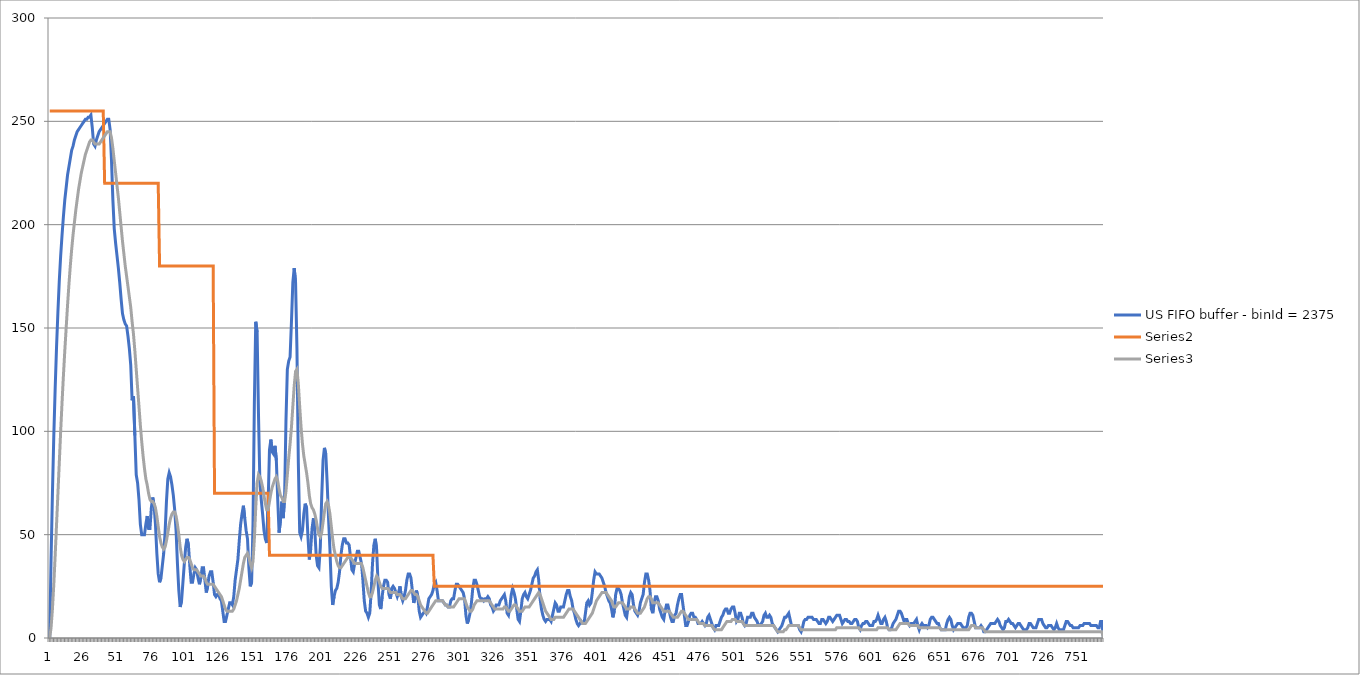
| Category | US FIFO buffer - binId = 2375 | Series 1 | Series 2 |
|---|---|---|---|
| 0 | 0 | 255 | 0 |
| 1 | 38 | 255 | 5 |
| 2 | 70 | 255 | 14 |
| 3 | 98 | 255 | 26 |
| 4 | 121 | 255 | 40 |
| 5 | 141 | 255 | 55 |
| 6 | 158 | 255 | 70 |
| 7 | 173 | 255 | 85 |
| 8 | 185 | 255 | 100 |
| 9 | 195 | 255 | 114 |
| 10 | 204 | 255 | 127 |
| 11 | 212 | 255 | 139 |
| 12 | 218 | 255 | 150 |
| 13 | 224 | 255 | 161 |
| 14 | 228 | 255 | 171 |
| 15 | 232 | 255 | 180 |
| 16 | 236 | 255 | 188 |
| 17 | 238 | 255 | 195 |
| 18 | 241 | 255 | 201 |
| 19 | 243 | 255 | 207 |
| 20 | 245 | 255 | 212 |
| 21 | 246 | 255 | 217 |
| 22 | 247 | 255 | 221 |
| 23 | 248 | 255 | 225 |
| 24 | 249 | 255 | 228 |
| 25 | 250 | 255 | 231 |
| 26 | 251 | 255 | 234 |
| 27 | 251 | 255 | 236 |
| 28 | 252 | 255 | 238 |
| 29 | 252 | 255 | 240 |
| 30 | 253 | 255 | 241 |
| 31 | 247 | 255 | 241 |
| 32 | 239 | 255 | 240 |
| 33 | 238 | 255 | 239 |
| 34 | 241 | 255 | 239 |
| 35 | 243 | 255 | 239 |
| 36 | 245 | 255 | 239 |
| 37 | 246 | 255 | 240 |
| 38 | 247 | 255 | 241 |
| 39 | 248 | 255 | 242 |
| 40 | 249 | 220 | 243 |
| 41 | 250 | 220 | 244 |
| 42 | 251 | 220 | 245 |
| 43 | 251 | 220 | 245 |
| 44 | 246 | 220 | 245 |
| 45 | 231 | 220 | 242 |
| 46 | 212 | 220 | 237 |
| 47 | 198 | 220 | 231 |
| 48 | 191 | 220 | 225 |
| 49 | 185 | 220 | 219 |
| 50 | 179 | 220 | 213 |
| 51 | 172 | 220 | 206 |
| 52 | 164 | 220 | 199 |
| 53 | 157 | 220 | 192 |
| 54 | 154 | 220 | 186 |
| 55 | 152 | 220 | 180 |
| 56 | 151 | 220 | 175 |
| 57 | 146 | 220 | 170 |
| 58 | 140 | 220 | 165 |
| 59 | 132 | 220 | 160 |
| 60 | 115 | 220 | 153 |
| 61 | 117 | 220 | 147 |
| 62 | 98 | 220 | 139 |
| 63 | 79 | 220 | 130 |
| 64 | 75 | 220 | 121 |
| 65 | 67 | 220 | 112 |
| 66 | 55 | 220 | 103 |
| 67 | 50 | 220 | 95 |
| 68 | 50 | 220 | 88 |
| 69 | 50 | 220 | 82 |
| 70 | 55 | 220 | 77 |
| 71 | 59 | 220 | 74 |
| 72 | 53 | 220 | 70 |
| 73 | 53 | 220 | 67 |
| 74 | 63 | 220 | 66 |
| 75 | 68 | 220 | 66 |
| 76 | 64 | 220 | 65 |
| 77 | 55 | 220 | 63 |
| 78 | 41 | 220 | 59 |
| 79 | 31 | 220 | 54 |
| 80 | 27 | 180 | 49 |
| 81 | 29 | 180 | 46 |
| 82 | 35 | 180 | 44 |
| 83 | 41 | 180 | 43 |
| 84 | 51 | 180 | 44 |
| 85 | 66 | 180 | 47 |
| 86 | 77 | 180 | 51 |
| 87 | 80 | 180 | 55 |
| 88 | 78 | 180 | 58 |
| 89 | 74 | 180 | 60 |
| 90 | 69 | 180 | 61 |
| 91 | 62 | 180 | 61 |
| 92 | 52 | 180 | 59 |
| 93 | 36 | 180 | 55 |
| 94 | 23 | 180 | 50 |
| 95 | 15 | 180 | 44 |
| 96 | 18 | 180 | 40 |
| 97 | 27 | 180 | 38 |
| 98 | 36 | 180 | 37 |
| 99 | 44 | 180 | 38 |
| 100 | 48 | 180 | 39 |
| 101 | 45 | 180 | 39 |
| 102 | 35 | 180 | 38 |
| 103 | 27 | 180 | 36 |
| 104 | 27 | 180 | 34 |
| 105 | 31 | 180 | 33 |
| 106 | 34 | 180 | 33 |
| 107 | 33 | 180 | 33 |
| 108 | 29 | 180 | 32 |
| 109 | 26 | 180 | 31 |
| 110 | 29 | 180 | 30 |
| 111 | 34 | 180 | 30 |
| 112 | 34 | 180 | 30 |
| 113 | 28 | 180 | 29 |
| 114 | 22 | 180 | 27 |
| 115 | 25 | 180 | 26 |
| 116 | 30 | 180 | 26 |
| 117 | 32 | 180 | 26 |
| 118 | 32 | 180 | 26 |
| 119 | 27 | 180 | 26 |
| 120 | 21 | 70 | 25 |
| 121 | 20 | 70 | 24 |
| 122 | 21 | 70 | 23 |
| 123 | 21 | 70 | 22 |
| 124 | 19 | 70 | 21 |
| 125 | 18 | 70 | 20 |
| 126 | 13 | 70 | 18 |
| 127 | 8 | 70 | 16 |
| 128 | 8 | 70 | 14 |
| 129 | 11 | 70 | 13 |
| 130 | 14 | 70 | 13 |
| 131 | 17 | 70 | 13 |
| 132 | 17 | 70 | 13 |
| 133 | 16 | 70 | 13 |
| 134 | 20 | 70 | 14 |
| 135 | 28 | 70 | 16 |
| 136 | 33 | 70 | 18 |
| 137 | 38 | 70 | 21 |
| 138 | 47 | 70 | 24 |
| 139 | 55 | 70 | 28 |
| 140 | 60 | 70 | 32 |
| 141 | 64 | 70 | 36 |
| 142 | 58 | 70 | 39 |
| 143 | 52 | 70 | 40 |
| 144 | 48 | 70 | 41 |
| 145 | 34 | 70 | 39 |
| 146 | 25 | 70 | 36 |
| 147 | 27 | 70 | 34 |
| 148 | 55 | 70 | 37 |
| 149 | 114 | 70 | 48 |
| 150 | 153 | 70 | 63 |
| 151 | 148 | 70 | 75 |
| 152 | 108 | 70 | 79 |
| 153 | 76 | 70 | 78 |
| 154 | 67 | 70 | 76 |
| 155 | 60 | 70 | 73 |
| 156 | 52 | 70 | 69 |
| 157 | 48 | 70 | 65 |
| 158 | 46 | 70 | 62 |
| 159 | 65 | 70 | 62 |
| 160 | 91 | 40 | 66 |
| 161 | 96 | 40 | 70 |
| 162 | 90 | 40 | 73 |
| 163 | 89 | 40 | 75 |
| 164 | 93 | 40 | 77 |
| 165 | 86 | 40 | 78 |
| 166 | 67 | 40 | 76 |
| 167 | 51 | 40 | 72 |
| 168 | 57 | 40 | 69 |
| 169 | 66 | 40 | 68 |
| 170 | 58 | 40 | 66 |
| 171 | 68 | 40 | 66 |
| 172 | 105 | 40 | 71 |
| 173 | 130 | 40 | 79 |
| 174 | 134 | 40 | 87 |
| 175 | 136 | 40 | 94 |
| 176 | 153 | 40 | 102 |
| 177 | 172 | 40 | 112 |
| 178 | 179 | 40 | 122 |
| 179 | 172 | 40 | 129 |
| 180 | 140 | 40 | 130 |
| 181 | 85 | 40 | 123 |
| 182 | 51 | 40 | 112 |
| 183 | 49 | 40 | 102 |
| 184 | 52 | 40 | 94 |
| 185 | 60 | 40 | 88 |
| 186 | 65 | 40 | 84 |
| 187 | 63 | 40 | 80 |
| 188 | 49 | 40 | 75 |
| 189 | 38 | 40 | 69 |
| 190 | 43 | 40 | 65 |
| 191 | 53 | 40 | 63 |
| 192 | 58 | 40 | 62 |
| 193 | 52 | 40 | 60 |
| 194 | 40 | 40 | 57 |
| 195 | 35 | 40 | 53 |
| 196 | 34 | 40 | 50 |
| 197 | 44 | 40 | 49 |
| 198 | 68 | 40 | 51 |
| 199 | 86 | 40 | 56 |
| 200 | 92 | 40 | 61 |
| 201 | 89 | 40 | 65 |
| 202 | 75 | 40 | 66 |
| 203 | 58 | 40 | 64 |
| 204 | 43 | 40 | 60 |
| 205 | 25 | 40 | 54 |
| 206 | 16 | 40 | 48 |
| 207 | 20 | 40 | 43 |
| 208 | 23 | 40 | 40 |
| 209 | 24 | 40 | 37 |
| 210 | 27 | 40 | 35 |
| 211 | 32 | 40 | 34 |
| 212 | 40 | 40 | 34 |
| 213 | 45 | 40 | 35 |
| 214 | 48 | 40 | 36 |
| 215 | 48 | 40 | 37 |
| 216 | 46 | 40 | 38 |
| 217 | 46 | 40 | 39 |
| 218 | 45 | 40 | 39 |
| 219 | 39 | 40 | 39 |
| 220 | 33 | 40 | 38 |
| 221 | 32 | 40 | 37 |
| 222 | 36 | 40 | 36 |
| 223 | 39 | 40 | 36 |
| 224 | 42 | 40 | 36 |
| 225 | 42 | 40 | 36 |
| 226 | 39 | 40 | 36 |
| 227 | 36 | 40 | 36 |
| 228 | 28 | 40 | 34 |
| 229 | 18 | 40 | 31 |
| 230 | 13 | 40 | 28 |
| 231 | 12 | 40 | 25 |
| 232 | 10 | 40 | 22 |
| 233 | 12 | 40 | 20 |
| 234 | 22 | 40 | 20 |
| 235 | 36 | 40 | 22 |
| 236 | 45 | 40 | 25 |
| 237 | 48 | 40 | 28 |
| 238 | 43 | 40 | 30 |
| 239 | 27 | 40 | 29 |
| 240 | 16 | 40 | 27 |
| 241 | 14 | 40 | 25 |
| 242 | 20 | 40 | 24 |
| 243 | 25 | 40 | 24 |
| 244 | 28 | 40 | 24 |
| 245 | 28 | 40 | 24 |
| 246 | 27 | 40 | 24 |
| 247 | 21 | 40 | 23 |
| 248 | 19 | 40 | 22 |
| 249 | 24 | 40 | 22 |
| 250 | 25 | 40 | 22 |
| 251 | 24 | 40 | 22 |
| 252 | 22 | 40 | 22 |
| 253 | 20 | 40 | 21 |
| 254 | 22 | 40 | 21 |
| 255 | 25 | 40 | 21 |
| 256 | 20 | 40 | 20 |
| 257 | 18 | 40 | 19 |
| 258 | 20 | 40 | 19 |
| 259 | 23 | 40 | 19 |
| 260 | 28 | 40 | 20 |
| 261 | 31 | 40 | 21 |
| 262 | 31 | 40 | 22 |
| 263 | 29 | 40 | 23 |
| 264 | 23 | 40 | 23 |
| 265 | 17 | 40 | 22 |
| 266 | 19 | 40 | 21 |
| 267 | 23 | 40 | 21 |
| 268 | 20 | 40 | 20 |
| 269 | 13 | 40 | 18 |
| 270 | 10 | 40 | 16 |
| 271 | 11 | 40 | 15 |
| 272 | 12 | 40 | 14 |
| 273 | 13 | 40 | 13 |
| 274 | 12 | 40 | 12 |
| 275 | 15 | 40 | 12 |
| 276 | 19 | 40 | 13 |
| 277 | 20 | 40 | 14 |
| 278 | 21 | 40 | 15 |
| 279 | 23 | 40 | 16 |
| 280 | 26 | 25 | 17 |
| 281 | 27 | 25 | 18 |
| 282 | 23 | 25 | 18 |
| 283 | 18 | 25 | 18 |
| 284 | 18 | 25 | 18 |
| 285 | 18 | 25 | 18 |
| 286 | 18 | 25 | 18 |
| 287 | 17 | 25 | 17 |
| 288 | 16 | 25 | 16 |
| 289 | 16 | 25 | 16 |
| 290 | 15 | 25 | 15 |
| 291 | 15 | 25 | 15 |
| 292 | 18 | 25 | 15 |
| 293 | 19 | 25 | 15 |
| 294 | 19 | 25 | 15 |
| 295 | 23 | 25 | 16 |
| 296 | 26 | 25 | 17 |
| 297 | 26 | 25 | 18 |
| 298 | 25 | 25 | 19 |
| 299 | 24 | 25 | 19 |
| 300 | 23 | 25 | 19 |
| 301 | 22 | 25 | 19 |
| 302 | 19 | 25 | 19 |
| 303 | 11 | 25 | 17 |
| 304 | 7 | 25 | 15 |
| 305 | 9 | 25 | 14 |
| 306 | 12 | 25 | 13 |
| 307 | 17 | 25 | 13 |
| 308 | 24 | 25 | 14 |
| 309 | 28 | 25 | 16 |
| 310 | 28 | 25 | 17 |
| 311 | 26 | 25 | 18 |
| 312 | 23 | 25 | 18 |
| 313 | 20 | 25 | 18 |
| 314 | 19 | 25 | 18 |
| 315 | 19 | 25 | 18 |
| 316 | 18 | 25 | 18 |
| 317 | 19 | 25 | 18 |
| 318 | 19 | 25 | 18 |
| 319 | 20 | 25 | 18 |
| 320 | 19 | 25 | 18 |
| 321 | 16 | 25 | 17 |
| 322 | 15 | 25 | 16 |
| 323 | 13 | 25 | 15 |
| 324 | 14 | 25 | 14 |
| 325 | 16 | 25 | 14 |
| 326 | 16 | 25 | 14 |
| 327 | 16 | 25 | 14 |
| 328 | 18 | 25 | 14 |
| 329 | 19 | 25 | 14 |
| 330 | 20 | 25 | 14 |
| 331 | 21 | 25 | 15 |
| 332 | 18 | 25 | 15 |
| 333 | 12 | 25 | 14 |
| 334 | 11 | 25 | 13 |
| 335 | 15 | 25 | 13 |
| 336 | 21 | 25 | 14 |
| 337 | 24 | 25 | 15 |
| 338 | 22 | 25 | 16 |
| 339 | 19 | 25 | 16 |
| 340 | 14 | 25 | 15 |
| 341 | 9 | 25 | 14 |
| 342 | 8 | 25 | 13 |
| 343 | 13 | 25 | 13 |
| 344 | 19 | 25 | 13 |
| 345 | 21 | 25 | 14 |
| 346 | 22 | 25 | 15 |
| 347 | 20 | 25 | 15 |
| 348 | 19 | 25 | 15 |
| 349 | 21 | 25 | 15 |
| 350 | 23 | 25 | 16 |
| 351 | 26 | 25 | 17 |
| 352 | 29 | 25 | 18 |
| 353 | 30 | 25 | 19 |
| 354 | 32 | 25 | 20 |
| 355 | 33 | 25 | 21 |
| 356 | 28 | 25 | 22 |
| 357 | 19 | 25 | 21 |
| 358 | 14 | 25 | 19 |
| 359 | 11 | 25 | 17 |
| 360 | 9 | 25 | 15 |
| 361 | 8 | 25 | 13 |
| 362 | 9 | 25 | 12 |
| 363 | 9 | 25 | 11 |
| 364 | 9 | 25 | 10 |
| 365 | 8 | 25 | 9 |
| 366 | 11 | 25 | 9 |
| 367 | 14 | 25 | 9 |
| 368 | 17 | 25 | 10 |
| 369 | 16 | 25 | 10 |
| 370 | 13 | 25 | 10 |
| 371 | 13 | 25 | 10 |
| 372 | 15 | 25 | 10 |
| 373 | 15 | 25 | 10 |
| 374 | 15 | 25 | 10 |
| 375 | 18 | 25 | 11 |
| 376 | 21 | 25 | 12 |
| 377 | 23 | 25 | 13 |
| 378 | 23 | 25 | 14 |
| 379 | 20 | 25 | 14 |
| 380 | 18 | 25 | 14 |
| 381 | 14 | 25 | 14 |
| 382 | 12 | 25 | 13 |
| 383 | 9 | 25 | 12 |
| 384 | 7 | 25 | 11 |
| 385 | 6 | 25 | 10 |
| 386 | 7 | 25 | 9 |
| 387 | 8 | 25 | 8 |
| 388 | 7 | 25 | 7 |
| 389 | 7 | 25 | 7 |
| 390 | 12 | 25 | 7 |
| 391 | 17 | 25 | 8 |
| 392 | 18 | 25 | 9 |
| 393 | 16 | 25 | 10 |
| 394 | 17 | 25 | 11 |
| 395 | 22 | 25 | 12 |
| 396 | 28 | 25 | 14 |
| 397 | 32 | 25 | 16 |
| 398 | 31 | 25 | 18 |
| 399 | 31 | 25 | 19 |
| 400 | 31 | 25 | 20 |
| 401 | 30 | 25 | 21 |
| 402 | 29 | 25 | 22 |
| 403 | 27 | 25 | 22 |
| 404 | 25 | 25 | 22 |
| 405 | 22 | 25 | 22 |
| 406 | 20 | 25 | 21 |
| 407 | 18 | 25 | 20 |
| 408 | 17 | 25 | 19 |
| 409 | 14 | 25 | 18 |
| 410 | 10 | 25 | 16 |
| 411 | 13 | 25 | 15 |
| 412 | 21 | 25 | 15 |
| 413 | 24 | 25 | 16 |
| 414 | 24 | 25 | 17 |
| 415 | 23 | 25 | 17 |
| 416 | 21 | 25 | 17 |
| 417 | 17 | 25 | 17 |
| 418 | 14 | 25 | 16 |
| 419 | 11 | 25 | 15 |
| 420 | 10 | 25 | 14 |
| 421 | 15 | 25 | 14 |
| 422 | 20 | 25 | 14 |
| 423 | 22 | 25 | 15 |
| 424 | 21 | 25 | 15 |
| 425 | 16 | 25 | 15 |
| 426 | 13 | 25 | 14 |
| 427 | 12 | 25 | 13 |
| 428 | 11 | 25 | 12 |
| 429 | 13 | 25 | 12 |
| 430 | 17 | 25 | 12 |
| 431 | 19 | 25 | 13 |
| 432 | 21 | 25 | 14 |
| 433 | 27 | 25 | 15 |
| 434 | 31 | 25 | 17 |
| 435 | 31 | 25 | 19 |
| 436 | 28 | 25 | 20 |
| 437 | 23 | 25 | 20 |
| 438 | 14 | 25 | 19 |
| 439 | 12 | 25 | 17 |
| 440 | 17 | 25 | 17 |
| 441 | 20 | 25 | 17 |
| 442 | 20 | 25 | 17 |
| 443 | 18 | 25 | 17 |
| 444 | 14 | 25 | 16 |
| 445 | 12 | 25 | 15 |
| 446 | 10 | 25 | 14 |
| 447 | 9 | 25 | 13 |
| 448 | 13 | 25 | 13 |
| 449 | 16 | 25 | 13 |
| 450 | 16 | 25 | 13 |
| 451 | 13 | 25 | 13 |
| 452 | 10 | 25 | 12 |
| 453 | 8 | 25 | 11 |
| 454 | 8 | 25 | 10 |
| 455 | 11 | 25 | 10 |
| 456 | 12 | 25 | 10 |
| 457 | 16 | 25 | 10 |
| 458 | 19 | 25 | 11 |
| 459 | 21 | 25 | 12 |
| 460 | 21 | 25 | 13 |
| 461 | 16 | 25 | 13 |
| 462 | 11 | 25 | 12 |
| 463 | 6 | 25 | 11 |
| 464 | 6 | 25 | 10 |
| 465 | 8 | 25 | 9 |
| 466 | 11 | 25 | 9 |
| 467 | 12 | 25 | 9 |
| 468 | 12 | 25 | 9 |
| 469 | 10 | 25 | 9 |
| 470 | 10 | 25 | 9 |
| 471 | 9 | 25 | 9 |
| 472 | 7 | 25 | 8 |
| 473 | 7 | 25 | 7 |
| 474 | 7 | 25 | 7 |
| 475 | 8 | 25 | 7 |
| 476 | 7 | 25 | 7 |
| 477 | 6 | 25 | 6 |
| 478 | 7 | 25 | 6 |
| 479 | 10 | 25 | 6 |
| 480 | 11 | 25 | 6 |
| 481 | 9 | 25 | 6 |
| 482 | 7 | 25 | 6 |
| 483 | 5 | 25 | 5 |
| 484 | 4 | 25 | 4 |
| 485 | 6 | 25 | 4 |
| 486 | 6 | 25 | 4 |
| 487 | 6 | 25 | 4 |
| 488 | 8 | 25 | 4 |
| 489 | 10 | 25 | 4 |
| 490 | 11 | 25 | 5 |
| 491 | 13 | 25 | 6 |
| 492 | 14 | 25 | 7 |
| 493 | 14 | 25 | 8 |
| 494 | 12 | 25 | 8 |
| 495 | 12 | 25 | 8 |
| 496 | 14 | 25 | 8 |
| 497 | 15 | 25 | 9 |
| 498 | 15 | 25 | 9 |
| 499 | 12 | 25 | 9 |
| 500 | 8 | 25 | 8 |
| 501 | 9 | 25 | 8 |
| 502 | 12 | 25 | 8 |
| 503 | 12 | 25 | 8 |
| 504 | 10 | 25 | 8 |
| 505 | 7 | 25 | 7 |
| 506 | 6 | 25 | 6 |
| 507 | 7 | 25 | 6 |
| 508 | 10 | 25 | 6 |
| 509 | 10 | 25 | 6 |
| 510 | 10 | 25 | 6 |
| 511 | 12 | 25 | 6 |
| 512 | 12 | 25 | 6 |
| 513 | 10 | 25 | 6 |
| 514 | 9 | 25 | 6 |
| 515 | 8 | 25 | 6 |
| 516 | 6 | 25 | 6 |
| 517 | 6 | 25 | 6 |
| 518 | 7 | 25 | 6 |
| 519 | 8 | 25 | 6 |
| 520 | 11 | 25 | 6 |
| 521 | 12 | 25 | 6 |
| 522 | 10 | 25 | 6 |
| 523 | 10 | 25 | 6 |
| 524 | 11 | 25 | 6 |
| 525 | 10 | 25 | 6 |
| 526 | 7 | 25 | 6 |
| 527 | 6 | 25 | 6 |
| 528 | 5 | 25 | 5 |
| 529 | 4 | 25 | 4 |
| 530 | 3 | 25 | 3 |
| 531 | 4 | 25 | 3 |
| 532 | 5 | 25 | 3 |
| 533 | 6 | 25 | 3 |
| 534 | 8 | 25 | 3 |
| 535 | 10 | 25 | 4 |
| 536 | 10 | 25 | 4 |
| 537 | 11 | 25 | 5 |
| 538 | 12 | 25 | 6 |
| 539 | 9 | 25 | 6 |
| 540 | 6 | 25 | 6 |
| 541 | 6 | 25 | 6 |
| 542 | 6 | 25 | 6 |
| 543 | 6 | 25 | 6 |
| 544 | 6 | 25 | 6 |
| 545 | 6 | 25 | 6 |
| 546 | 4 | 25 | 5 |
| 547 | 3 | 25 | 4 |
| 548 | 5 | 25 | 4 |
| 549 | 8 | 25 | 4 |
| 550 | 9 | 25 | 4 |
| 551 | 9 | 25 | 4 |
| 552 | 10 | 25 | 4 |
| 553 | 10 | 25 | 4 |
| 554 | 10 | 25 | 4 |
| 555 | 10 | 25 | 4 |
| 556 | 9 | 25 | 4 |
| 557 | 9 | 25 | 4 |
| 558 | 9 | 25 | 4 |
| 559 | 8 | 25 | 4 |
| 560 | 7 | 25 | 4 |
| 561 | 7 | 25 | 4 |
| 562 | 9 | 25 | 4 |
| 563 | 9 | 25 | 4 |
| 564 | 8 | 25 | 4 |
| 565 | 7 | 25 | 4 |
| 566 | 8 | 25 | 4 |
| 567 | 10 | 25 | 4 |
| 568 | 10 | 25 | 4 |
| 569 | 9 | 25 | 4 |
| 570 | 8 | 25 | 4 |
| 571 | 9 | 25 | 4 |
| 572 | 10 | 25 | 4 |
| 573 | 11 | 25 | 5 |
| 574 | 11 | 25 | 5 |
| 575 | 11 | 25 | 5 |
| 576 | 9 | 25 | 5 |
| 577 | 7 | 25 | 5 |
| 578 | 8 | 25 | 5 |
| 579 | 9 | 25 | 5 |
| 580 | 9 | 25 | 5 |
| 581 | 8 | 25 | 5 |
| 582 | 8 | 25 | 5 |
| 583 | 7 | 25 | 5 |
| 584 | 7 | 25 | 5 |
| 585 | 8 | 25 | 5 |
| 586 | 9 | 25 | 5 |
| 587 | 9 | 25 | 5 |
| 588 | 8 | 25 | 5 |
| 589 | 5 | 25 | 5 |
| 590 | 4 | 25 | 4 |
| 591 | 6 | 25 | 4 |
| 592 | 7 | 25 | 4 |
| 593 | 7 | 25 | 4 |
| 594 | 8 | 25 | 4 |
| 595 | 8 | 25 | 4 |
| 596 | 7 | 25 | 4 |
| 597 | 6 | 25 | 4 |
| 598 | 6 | 25 | 4 |
| 599 | 6 | 25 | 4 |
| 600 | 8 | 25 | 4 |
| 601 | 8 | 25 | 4 |
| 602 | 9 | 25 | 4 |
| 603 | 11 | 25 | 5 |
| 604 | 9 | 25 | 5 |
| 605 | 7 | 25 | 5 |
| 606 | 7 | 25 | 5 |
| 607 | 9 | 25 | 5 |
| 608 | 10 | 25 | 5 |
| 609 | 8 | 25 | 5 |
| 610 | 5 | 25 | 5 |
| 611 | 4 | 25 | 4 |
| 612 | 4 | 25 | 4 |
| 613 | 5 | 25 | 4 |
| 614 | 7 | 25 | 4 |
| 615 | 8 | 25 | 4 |
| 616 | 9 | 25 | 4 |
| 617 | 11 | 25 | 5 |
| 618 | 13 | 25 | 6 |
| 619 | 13 | 25 | 7 |
| 620 | 12 | 25 | 7 |
| 621 | 10 | 25 | 7 |
| 622 | 8 | 25 | 7 |
| 623 | 9 | 25 | 7 |
| 624 | 9 | 25 | 7 |
| 625 | 7 | 25 | 7 |
| 626 | 6 | 25 | 6 |
| 627 | 7 | 25 | 6 |
| 628 | 7 | 25 | 6 |
| 629 | 7 | 25 | 6 |
| 630 | 8 | 25 | 6 |
| 631 | 9 | 25 | 6 |
| 632 | 6 | 25 | 6 |
| 633 | 4 | 25 | 5 |
| 634 | 6 | 25 | 5 |
| 635 | 7 | 25 | 5 |
| 636 | 6 | 25 | 5 |
| 637 | 6 | 25 | 5 |
| 638 | 6 | 25 | 5 |
| 639 | 5 | 25 | 5 |
| 640 | 6 | 25 | 5 |
| 641 | 9 | 25 | 5 |
| 642 | 10 | 25 | 5 |
| 643 | 10 | 25 | 5 |
| 644 | 9 | 25 | 5 |
| 645 | 8 | 25 | 5 |
| 646 | 7 | 25 | 5 |
| 647 | 7 | 25 | 5 |
| 648 | 5 | 25 | 5 |
| 649 | 4 | 25 | 4 |
| 650 | 4 | 25 | 4 |
| 651 | 4 | 25 | 4 |
| 652 | 4 | 25 | 4 |
| 653 | 7 | 25 | 4 |
| 654 | 9 | 25 | 4 |
| 655 | 10 | 25 | 4 |
| 656 | 9 | 25 | 4 |
| 657 | 6 | 25 | 4 |
| 658 | 4 | 25 | 4 |
| 659 | 5 | 25 | 4 |
| 660 | 6 | 25 | 4 |
| 661 | 7 | 25 | 4 |
| 662 | 7 | 25 | 4 |
| 663 | 7 | 25 | 4 |
| 664 | 6 | 25 | 4 |
| 665 | 5 | 25 | 4 |
| 666 | 5 | 25 | 4 |
| 667 | 5 | 25 | 4 |
| 668 | 6 | 25 | 4 |
| 669 | 10 | 25 | 4 |
| 670 | 12 | 25 | 5 |
| 671 | 12 | 25 | 6 |
| 672 | 11 | 25 | 6 |
| 673 | 8 | 25 | 6 |
| 674 | 5 | 25 | 5 |
| 675 | 5 | 25 | 5 |
| 676 | 5 | 25 | 5 |
| 677 | 5 | 25 | 5 |
| 678 | 6 | 25 | 5 |
| 679 | 5 | 25 | 5 |
| 680 | 3 | 25 | 4 |
| 681 | 3 | 25 | 3 |
| 682 | 4 | 25 | 3 |
| 683 | 5 | 25 | 3 |
| 684 | 6 | 25 | 3 |
| 685 | 7 | 25 | 3 |
| 686 | 7 | 25 | 3 |
| 687 | 7 | 25 | 3 |
| 688 | 7 | 25 | 3 |
| 689 | 8 | 25 | 3 |
| 690 | 9 | 25 | 3 |
| 691 | 8 | 25 | 3 |
| 692 | 6 | 25 | 3 |
| 693 | 5 | 25 | 3 |
| 694 | 4 | 25 | 3 |
| 695 | 5 | 25 | 3 |
| 696 | 8 | 25 | 3 |
| 697 | 8 | 25 | 3 |
| 698 | 9 | 25 | 3 |
| 699 | 8 | 25 | 3 |
| 700 | 7 | 25 | 3 |
| 701 | 7 | 25 | 3 |
| 702 | 6 | 25 | 3 |
| 703 | 5 | 25 | 3 |
| 704 | 6 | 25 | 3 |
| 705 | 7 | 25 | 3 |
| 706 | 7 | 25 | 3 |
| 707 | 6 | 25 | 3 |
| 708 | 5 | 25 | 3 |
| 709 | 4 | 25 | 3 |
| 710 | 4 | 25 | 3 |
| 711 | 4 | 25 | 3 |
| 712 | 5 | 25 | 3 |
| 713 | 7 | 25 | 3 |
| 714 | 7 | 25 | 3 |
| 715 | 6 | 25 | 3 |
| 716 | 5 | 25 | 3 |
| 717 | 5 | 25 | 3 |
| 718 | 5 | 25 | 3 |
| 719 | 7 | 25 | 3 |
| 720 | 9 | 25 | 3 |
| 721 | 9 | 25 | 3 |
| 722 | 9 | 25 | 3 |
| 723 | 7 | 25 | 3 |
| 724 | 6 | 25 | 3 |
| 725 | 5 | 25 | 3 |
| 726 | 5 | 25 | 3 |
| 727 | 6 | 25 | 3 |
| 728 | 6 | 25 | 3 |
| 729 | 6 | 25 | 3 |
| 730 | 5 | 25 | 3 |
| 731 | 4 | 25 | 3 |
| 732 | 5 | 25 | 3 |
| 733 | 7 | 25 | 3 |
| 734 | 5 | 25 | 3 |
| 735 | 4 | 25 | 3 |
| 736 | 4 | 25 | 3 |
| 737 | 4 | 25 | 3 |
| 738 | 4 | 25 | 3 |
| 739 | 6 | 25 | 3 |
| 740 | 8 | 25 | 3 |
| 741 | 8 | 25 | 3 |
| 742 | 7 | 25 | 3 |
| 743 | 6 | 25 | 3 |
| 744 | 6 | 25 | 3 |
| 745 | 5 | 25 | 3 |
| 746 | 5 | 25 | 3 |
| 747 | 5 | 25 | 3 |
| 748 | 5 | 25 | 3 |
| 749 | 5 | 25 | 3 |
| 750 | 6 | 25 | 3 |
| 751 | 6 | 25 | 3 |
| 752 | 6 | 25 | 3 |
| 753 | 7 | 25 | 3 |
| 754 | 7 | 25 | 3 |
| 755 | 7 | 25 | 3 |
| 756 | 7 | 25 | 3 |
| 757 | 7 | 25 | 3 |
| 758 | 6 | 25 | 3 |
| 759 | 6 | 25 | 3 |
| 760 | 6 | 25 | 3 |
| 761 | 6 | 25 | 3 |
| 762 | 6 | 25 | 3 |
| 763 | 5 | 25 | 3 |
| 764 | 5 | 25 | 3 |
| 765 | 8 | 25 | 3 |
| 766 | 8 | 25 | 3 |
| 767 | 0 | 25 | 0 |